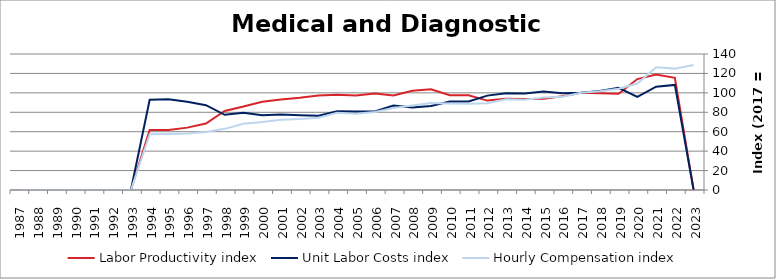
| Category | Labor Productivity index | Unit Labor Costs index | Hourly Compensation index |
|---|---|---|---|
| 2023.0 | 0 | 0 | 128.711 |
| 2022.0 | 115.508 | 108.174 | 124.95 |
| 2021.0 | 118.859 | 106.297 | 126.344 |
| 2020.0 | 114.195 | 95.934 | 109.553 |
| 2019.0 | 99.035 | 105.25 | 104.235 |
| 2018.0 | 99.627 | 102.044 | 101.663 |
| 2017.0 | 100 | 100 | 100 |
| 2016.0 | 96.425 | 99.583 | 96.023 |
| 2015.0 | 93.907 | 101.411 | 95.232 |
| 2014.0 | 93.612 | 99.274 | 92.933 |
| 2013.0 | 93.833 | 99.625 | 93.482 |
| 2012.0 | 92.032 | 97.164 | 89.423 |
| 2011.0 | 97.507 | 91.099 | 88.828 |
| 2010.0 | 97.59 | 91.129 | 88.933 |
| 2009.0 | 103.763 | 86.398 | 89.649 |
| 2008.0 | 102.167 | 85.026 | 86.868 |
| 2007.0 | 97.234 | 86.86 | 84.457 |
| 2006.0 | 99.267 | 80.791 | 80.199 |
| 2005.0 | 97.175 | 80.866 | 78.582 |
| 2004.0 | 97.99 | 81.061 | 79.432 |
| 2003.0 | 97.305 | 76.462 | 74.401 |
| 2002.0 | 94.995 | 77.069 | 73.211 |
| 2001.0 | 93.138 | 77.651 | 72.323 |
| 2000.0 | 90.917 | 77.059 | 70.06 |
| 1999.0 | 85.861 | 79.405 | 68.179 |
| 1998.0 | 81.306 | 77.416 | 62.944 |
| 1997.0 | 68.462 | 87.342 | 59.796 |
| 1996.0 | 64.215 | 90.762 | 58.282 |
| 1995.0 | 61.776 | 93.399 | 57.698 |
| 1994.0 | 61.863 | 92.889 | 57.464 |
| 1993.0 | 0 | 0 | 0 |
| 1992.0 | 0 | 0 | 0 |
| 1991.0 | 0 | 0 | 0 |
| 1990.0 | 0 | 0 | 0 |
| 1989.0 | 0 | 0 | 0 |
| 1988.0 | 0 | 0 | 0 |
| 1987.0 | 0 | 0 | 0 |